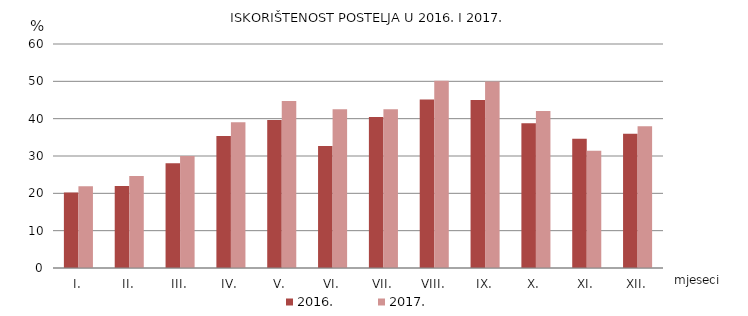
| Category | 2016. | 2017. |
|---|---|---|
| I. | 20.24 | 21.896 |
| II. | 21.991 | 24.674 |
| III. | 28.062 | 29.986 |
| IV. | 35.349 | 39.064 |
| V. | 39.645 | 44.705 |
| VI. | 32.704 | 42.493 |
| VII. | 40.432 | 42.517 |
| VIII. | 45.136 | 50.125 |
| IX. | 45.013 | 49.982 |
| X. | 38.746 | 42.048 |
| XI. | 34.634 | 31.381 |
| XII. | 35.936 | 37.987 |